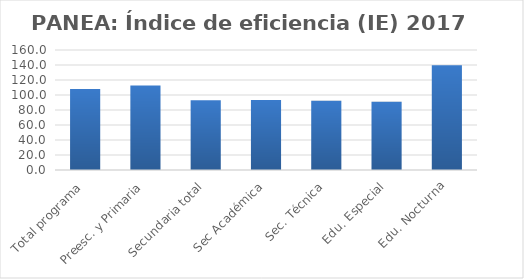
| Category | Índice de eficiencia (IE)  |
|---|---|
| Total programa | 108.073 |
| Preesc. y Primaria | 112.774 |
| Secundaria total | 93.037 |
| Sec Académica | 93.491 |
| Sec. Técnica | 92.305 |
| Edu. Especial | 91.128 |
| Edu. Nocturna | 139.769 |